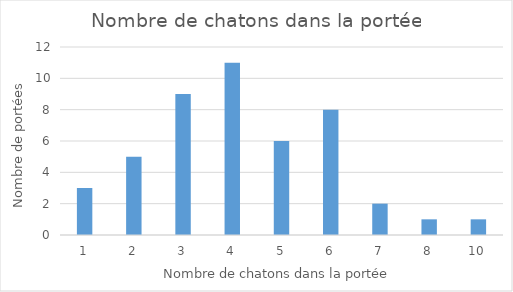
| Category | Series 0 |
|---|---|
| 1.0 | 3 |
| 2.0 | 5 |
| 3.0 | 9 |
| 4.0 | 11 |
| 5.0 | 6 |
| 6.0 | 8 |
| 7.0 | 2 |
| 8.0 | 1 |
| 10.0 | 1 |